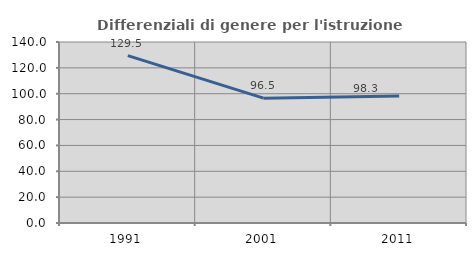
| Category | Differenziali di genere per l'istruzione superiore |
|---|---|
| 1991.0 | 129.475 |
| 2001.0 | 96.539 |
| 2011.0 | 98.256 |